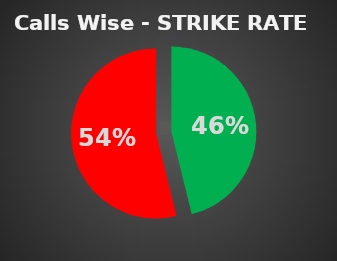
| Category | Series 0 |
|---|---|
| 0 | 0.462 |
| 1 | 0.538 |